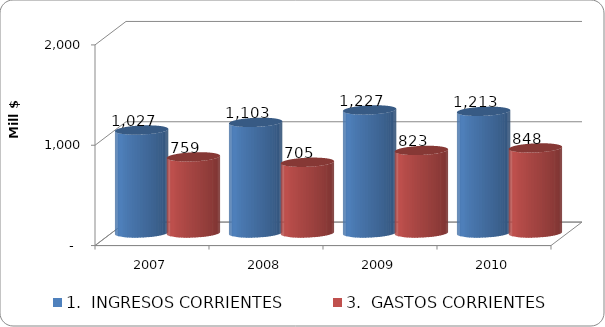
| Category | 1.  INGRESOS CORRIENTES | 3.  GASTOS CORRIENTES |
|---|---|---|
| 2007 | 1026.542 | 759.142 |
| 2008 | 1102.846 | 705.064 |
| 2009 | 1226.691 | 823.297 |
| 2010 | 1213 | 848 |